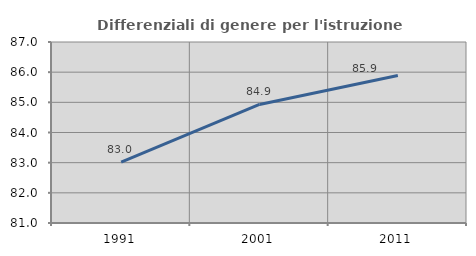
| Category | Differenziali di genere per l'istruzione superiore |
|---|---|
| 1991.0 | 83.018 |
| 2001.0 | 84.929 |
| 2011.0 | 85.892 |